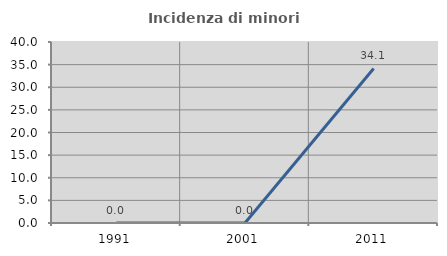
| Category | Incidenza di minori stranieri |
|---|---|
| 1991.0 | 0 |
| 2001.0 | 0 |
| 2011.0 | 34.146 |